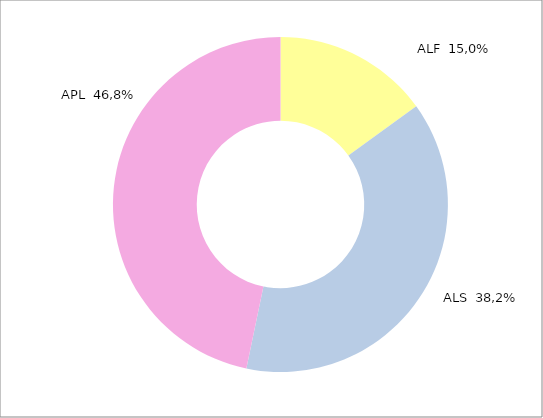
| Category | Series 0 |
|---|---|
| ALF | 21180 |
| ALS | 53855 |
| APL | 65830 |